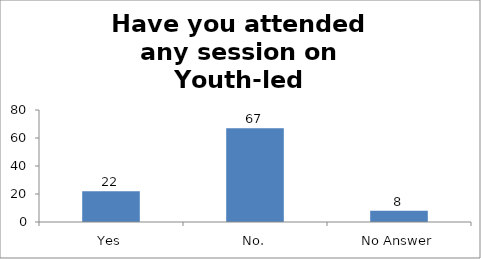
| Category | Have you attended any session on Youth-led Changemaking before? |
|---|---|
| Yes | 22 |
| No. | 67 |
| No Answer | 8 |